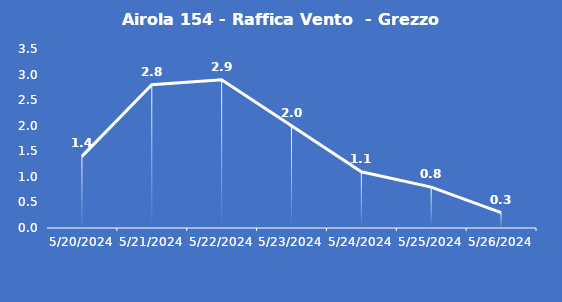
| Category | Airola 154 - Raffica Vento  - Grezzo (m/s) |
|---|---|
| 5/20/24 | 1.4 |
| 5/21/24 | 2.8 |
| 5/22/24 | 2.9 |
| 5/23/24 | 2 |
| 5/24/24 | 1.1 |
| 5/25/24 | 0.8 |
| 5/26/24 | 0.3 |